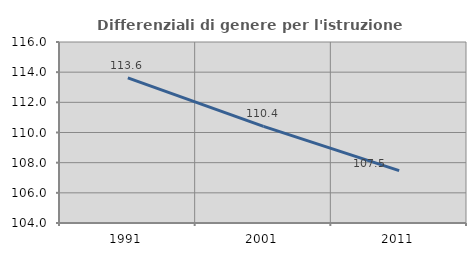
| Category | Differenziali di genere per l'istruzione superiore |
|---|---|
| 1991.0 | 113.623 |
| 2001.0 | 110.407 |
| 2011.0 | 107.47 |